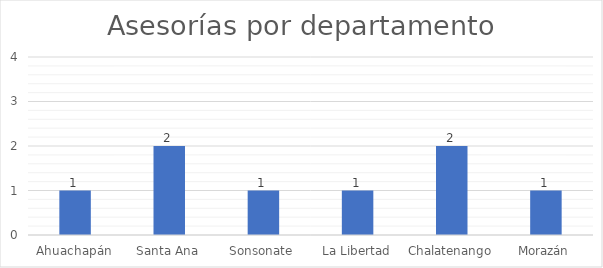
| Category | Series 0 |
|---|---|
| Ahuachapán | 1 |
| Santa Ana | 2 |
| Sonsonate | 1 |
| La Libertad | 1 |
| Chalatenango | 2 |
| Morazán | 1 |